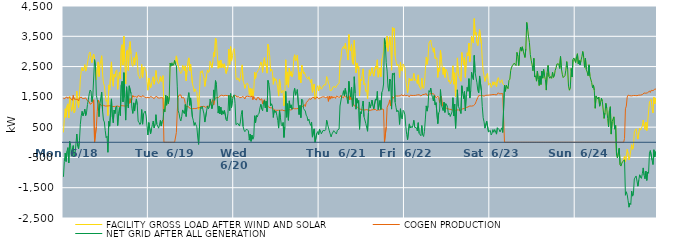
| Category | FACILITY GROSS LOAD AFTER WIND AND SOLAR | COGEN PRODUCTION | NET GRID AFTER ALL GENERATION |
|---|---|---|---|
|  Mon  6/18 | 328 | 1469 | -1141 |
|  Mon  6/18 | 793 | 1427 | -634 |
|  Mon  6/18 | 1109 | 1465 | -356 |
|  Mon  6/18 | 823 | 1457 | -634 |
|  Mon  6/18 | 1199 | 1496 | -297 |
|  Mon  6/18 | 1269 | 1446 | -177 |
|  Mon  6/18 | 801 | 1483 | -682 |
|  Mon  6/18 | 1516 | 1486 | 30 |
|  Mon  6/18 | 1353 | 1456 | -103 |
|  Mon  6/18 | 1024 | 1482 | -458 |
|  Mon  6/18 | 1159 | 1386 | -227 |
|  Mon  6/18 | 1441 | 1549 | -108 |
|  Mon  6/18 | 972 | 1428 | -456 |
|  Mon  6/18 | 1019 | 1435 | -416 |
|  Mon  6/18 | 1017 | 1418 | -401 |
|  Mon  6/18 | 1689 | 1416 | 273 |
|  Mon  6/18 | 1295 | 1422 | -127 |
|  Mon  6/18 | 1149 | 1365 | -216 |
|  Mon  6/18 | 1517 | 1464 | 53 |
|  Mon  6/18 | 2078 | 1487 | 591 |
|  Mon  6/18 | 2368 | 1494 | 874 |
|  Mon  6/18 | 2473 | 1451 | 1022 |
|  Mon  6/18 | 2356 | 1480 | 876 |
|  Mon  6/18 | 2409 | 1445 | 964 |
|  Mon  6/18 | 2563 | 1469 | 1094 |
|  Mon  6/18 | 2349 | 1466 | 883 |
|  Mon  6/18 | 2441 | 1449 | 992 |
|  Mon  6/18 | 2617 | 1369 | 1248 |
|  Mon  6/18 | 2774 | 1373 | 1401 |
|  Mon  6/18 | 2936 | 1337 | 1599 |
|  Mon  6/18 | 2981 | 1257 | 1724 |
|  Mon  6/18 | 2976 | 1289 | 1687 |
|  Mon  6/18 | 2630 | 1289 | 1341 |
|  Mon  6/18 | 2830 | 1310 | 1520 |
|  Mon  6/18 | 2912 | 1403 | 1509 |
|  Mon  6/18 | 2727 | 0 | 2727 |
|  Mon  6/18 | 2515 | 0 | 2515 |
|  Mon  6/18 | 2067 | 514 | 1553 |
|  Mon  6/18 | 2418 | 1008 | 1410 |
|  Mon  6/18 | 2655 | 1392 | 1263 |
|  Mon  6/18 | 2171 | 1325 | 846 |
|  Mon  6/18 | 2541 | 1271 | 1270 |
|  Mon  6/18 | 2552 | 1256 | 1296 |
|  Mon  6/18 | 2857 | 1201 | 1656 |
|  Mon  6/18 | 2251 | 1218 | 1033 |
|  Mon  6/18 | 1954 | 1220 | 734 |
|  Mon  6/18 | 1869 | 1198 | 671 |
|  Mon  6/18 | 1580 | 1197 | 383 |
|  Mon  6/18 | 1352 | 1202 | 150 |
|  Mon  6/18 | 1397 | 1198 | 199 |
|  Mon  6/18 | 882 | 1212 | -330 |
|  Mon  6/18 | 1893 | 1204 | 689 |
|  Mon  6/18 | 1726 | 1194 | 532 |
|  Mon  6/18 | 1745 | 1208 | 537 |
|  Mon  6/18 | 2654 | 1222 | 1432 |
|  Mon  6/18 | 2019 | 1182 | 837 |
|  Mon  6/18 | 1850 | 1205 | 645 |
|  Mon  6/18 | 2243 | 1181 | 1062 |
|  Mon  6/18 | 2153 | 1204 | 949 |
|  Mon  6/18 | 2346 | 1188 | 1158 |
|  Mon  6/18 | 2393 | 1194 | 1199 |
|  Mon  6/18 | 1749 | 1196 | 553 |
|  Mon  6/18 | 2122 | 1174 | 948 |
|  Mon  6/18 | 2320 | 1174 | 1146 |
|  Mon  6/18 | 2092 | 1210 | 882 |
|  Mon  6/18 | 3086 | 1198 | 1888 |
|  Mon  6/18 | 3224 | 1208 | 2016 |
|  Mon  6/18 | 2547 | 1211 | 1336 |
|  Mon  6/18 | 3500 | 1201 | 2299 |
|  Mon  6/18 | 2653 | 1183 | 1470 |
|  Mon  6/18 | 1926 | 1194 | 732 |
|  Mon  6/18 | 3005 | 1172 | 1833 |
|  Mon  6/18 | 3051 | 1212 | 1839 |
|  Mon  6/18 | 2370 | 1235 | 1135 |
|  Mon  6/18 | 3142 | 1277 | 1865 |
|  Mon  6/18 | 3326 | 1443 | 1883 |
|  Mon  6/18 | 2908 | 1300 | 1608 |
|  Mon  6/18 | 2556 | 1435 | 1121 |
|  Mon  6/18 | 2505 | 1551 | 954 |
|  Mon  6/18 | 2797 | 1496 | 1301 |
|  Mon  6/18 | 2553 | 1522 | 1031 |
|  Mon  6/18 | 2809 | 1509 | 1300 |
|  Mon  6/18 | 2974 | 1542 | 1432 |
|  Mon  6/18 | 2720 | 1483 | 1237 |
|  Mon  6/18 | 2244 | 1544 | 700 |
|  Mon  6/18 | 2173 | 1518 | 655 |
|  Mon  6/18 | 2100 | 1514 | 586 |
|  Mon  6/18 | 2166 | 1529 | 637 |
|  Mon  6/18 | 2574 | 1493 | 1081 |
|  Mon  6/18 | 2142 | 1544 | 598 |
|  Mon  6/18 | 2454 | 1520 | 934 |
|  Mon  6/18 | 2493 | 1501 | 992 |
|  Mon  6/18 | 2506 | 1474 | 1032 |
|  Mon  6/18 | 2337 | 1472 | 865 |
|  Mon  6/18 | 2011 | 1471 | 540 |
|  Mon  6/18 | 1720 | 1479 | 241 |
|  Tue  6/19 | 2120 | 1469 | 651 |
|  Tue  6/19 | 2129 | 1468 | 661 |
|  Tue  6/19 | 1794 | 1511 | 283 |
|  Tue  6/19 | 1928 | 1484 | 444 |
|  Tue  6/19 | 2064 | 1482 | 582 |
|  Tue  6/19 | 2163 | 1461 | 702 |
|  Tue  6/19 | 1915 | 1439 | 476 |
|  Tue  6/19 | 2080 | 1490 | 590 |
|  Tue  6/19 | 2370 | 1459 | 911 |
|  Tue  6/19 | 2109 | 1515 | 594 |
|  Tue  6/19 | 2003 | 1466 | 537 |
|  Tue  6/19 | 1936 | 1471 | 465 |
|  Tue  6/19 | 2025 | 1459 | 566 |
|  Tue  6/19 | 2174 | 1452 | 722 |
|  Tue  6/19 | 2010 | 1474 | 536 |
|  Tue  6/19 | 2144 | 1449 | 695 |
|  Tue  6/19 | 2201 | 1463 | 738 |
|  Tue  6/19 | 1087 | 0 | 1087 |
|  Tue  6/19 | 1010 | 0 | 1010 |
|  Tue  6/19 | 1556 | 0 | 1556 |
|  Tue  6/19 | 1223 | 0 | 1223 |
|  Tue  6/19 | 1526 | 0 | 1526 |
|  Tue  6/19 | 1279 | 0 | 1279 |
|  Tue  6/19 | 1488 | 0 | 1488 |
|  Tue  6/19 | 2611 | 0 | 2611 |
|  Tue  6/19 | 2515 | 0 | 2515 |
|  Tue  6/19 | 2625 | 0 | 2625 |
|  Tue  6/19 | 2528 | 0 | 2528 |
|  Tue  6/19 | 2587 | 0 | 2587 |
|  Tue  6/19 | 2700 | 0 | 2700 |
|  Tue  6/19 | 2563 | 0 | 2563 |
|  Tue  6/19 | 2852 | 323 | 2529 |
|  Tue  6/19 | 2860 | 1007 | 1853 |
|  Tue  6/19 | 2523 | 1485 | 1038 |
|  Tue  6/19 | 2517 | 1558 | 959 |
|  Tue  6/19 | 2337 | 1550 | 787 |
|  Tue  6/19 | 2269 | 1564 | 705 |
|  Tue  6/19 | 2304 | 1461 | 843 |
|  Tue  6/19 | 2541 | 1473 | 1068 |
|  Tue  6/19 | 2466 | 1482 | 984 |
|  Tue  6/19 | 2366 | 1423 | 943 |
|  Tue  6/19 | 2523 | 1275 | 1248 |
|  Tue  6/19 | 2031 | 1179 | 852 |
|  Tue  6/19 | 2388 | 1190 | 1198 |
|  Tue  6/19 | 2675 | 1194 | 1481 |
|  Tue  6/19 | 2787 | 1148 | 1639 |
|  Tue  6/19 | 2360 | 1140 | 1220 |
|  Tue  6/19 | 2581 | 1116 | 1465 |
|  Tue  6/19 | 2606 | 1125 | 1481 |
|  Tue  6/19 | 1946 | 1108 | 838 |
|  Tue  6/19 | 1826 | 1099 | 727 |
|  Tue  6/19 | 1674 | 1115 | 559 |
|  Tue  6/19 | 1763 | 1113 | 650 |
|  Tue  6/19 | 1686 | 1114 | 572 |
|  Tue  6/19 | 1640 | 1128 | 512 |
|  Tue  6/19 | 1310 | 1136 | 174 |
|  Tue  6/19 | 1082 | 1151 | -69 |
|  Tue  6/19 | 1673 | 1140 | 533 |
|  Tue  6/19 | 2337 | 1182 | 1155 |
|  Tue  6/19 | 2299 | 1186 | 1113 |
|  Tue  6/19 | 2368 | 1180 | 1188 |
|  Tue  6/19 | 2357 | 1174 | 1183 |
|  Tue  6/19 | 2124 | 1188 | 936 |
|  Tue  6/19 | 1845 | 1177 | 668 |
|  Tue  6/19 | 1827 | 1153 | 674 |
|  Tue  6/19 | 2212 | 1175 | 1037 |
|  Tue  6/19 | 2391 | 1192 | 1199 |
|  Tue  6/19 | 2308 | 1200 | 1108 |
|  Tue  6/19 | 2342 | 1193 | 1149 |
|  Tue  6/19 | 2671 | 1246 | 1425 |
|  Tue  6/19 | 2683 | 1264 | 1419 |
|  Tue  6/19 | 2459 | 1349 | 1110 |
|  Tue  6/19 | 2659 | 1412 | 1247 |
|  Tue  6/19 | 2966 | 1236 | 1730 |
|  Tue  6/19 | 2828 | 1439 | 1389 |
|  Tue  6/19 | 3443 | 1407 | 2036 |
|  Tue  6/19 | 3390 | 1473 | 1917 |
|  Tue  6/19 | 2914 | 1487 | 1427 |
|  Tue  6/19 | 2440 | 1476 | 964 |
|  Tue  6/19 | 2690 | 1494 | 1196 |
|  Tue  6/19 | 2467 | 1531 | 936 |
|  Tue  6/19 | 2712 | 1552 | 1160 |
|  Tue  6/19 | 2469 | 1557 | 912 |
|  Tue  6/19 | 2590 | 1552 | 1038 |
|  Tue  6/19 | 2466 | 1534 | 932 |
|  Tue  6/19 | 2591 | 1541 | 1050 |
|  Tue  6/19 | 2617 | 1549 | 1068 |
|  Tue  6/19 | 2273 | 1523 | 750 |
|  Tue  6/19 | 2247 | 1542 | 705 |
|  Tue  6/19 | 2501 | 1542 | 959 |
|  Tue  6/19 | 3079 | 1529 | 1550 |
|  Tue  6/19 | 2564 | 1517 | 1047 |
|  Tue  6/19 | 3158 | 1551 | 1607 |
|  Tue  6/19 | 2681 | 1538 | 1143 |
|  Tue  6/19 | 2857 | 1474 | 1383 |
|  Tue  6/19 | 3035 | 1507 | 1528 |
|  Wed  6/20 | 3095 | 1528 | 1567 |
|  Wed  6/20 | 2805 | 1521 | 1284 |
|  Wed  6/20 | 2128 | 1546 | 582 |
|  Wed  6/20 | 2063 | 1497 | 566 |
|  Wed  6/20 | 2129 | 1500 | 629 |
|  Wed  6/20 | 2105 | 1508 | 597 |
|  Wed  6/20 | 2009 | 1473 | 536 |
|  Wed  6/20 | 2148 | 1475 | 673 |
|  Wed  6/20 | 2399 | 1478 | 921 |
|  Wed  6/20 | 2557 | 1508 | 1049 |
|  Wed  6/20 | 2042 | 1515 | 527 |
|  Wed  6/20 | 1943 | 1535 | 408 |
|  Wed  6/20 | 1781 | 1430 | 351 |
|  Wed  6/20 | 1903 | 1510 | 393 |
|  Wed  6/20 | 1922 | 1486 | 436 |
|  Wed  6/20 | 1949 | 1522 | 427 |
|  Wed  6/20 | 1867 | 1490 | 377 |
|  Wed  6/20 | 1578 | 1508 | 70 |
|  Wed  6/20 | 1791 | 1517 | 274 |
|  Wed  6/20 | 1527 | 1496 | 31 |
|  Wed  6/20 | 1767 | 1532 | 235 |
|  Wed  6/20 | 1510 | 1409 | 101 |
|  Wed  6/20 | 1682 | 1509 | 173 |
|  Wed  6/20 | 2321 | 1445 | 876 |
|  Wed  6/20 | 2107 | 1468 | 639 |
|  Wed  6/20 | 2281 | 1396 | 885 |
|  Wed  6/20 | 2308 | 1475 | 833 |
|  Wed  6/20 | 2369 | 1449 | 920 |
|  Wed  6/20 | 2428 | 1468 | 960 |
|  Wed  6/20 | 2531 | 1392 | 1139 |
|  Wed  6/20 | 2653 | 1400 | 1253 |
|  Wed  6/20 | 2540 | 1437 | 1103 |
|  Wed  6/20 | 2309 | 1269 | 1040 |
|  Wed  6/20 | 2669 | 1363 | 1306 |
|  Wed  6/20 | 2794 | 1410 | 1384 |
|  Wed  6/20 | 2527 | 1390 | 1137 |
|  Wed  6/20 | 2579 | 1222 | 1357 |
|  Wed  6/20 | 2282 | 1272 | 1010 |
|  Wed  6/20 | 3236 | 1193 | 2043 |
|  Wed  6/20 | 3092 | 1154 | 1938 |
|  Wed  6/20 | 2837 | 1141 | 1696 |
|  Wed  6/20 | 2342 | 1139 | 1203 |
|  Wed  6/20 | 2414 | 1144 | 1270 |
|  Wed  6/20 | 2335 | 1134 | 1201 |
|  Wed  6/20 | 1913 | 1093 | 820 |
|  Wed  6/20 | 2129 | 1070 | 1059 |
|  Wed  6/20 | 2044 | 1059 | 985 |
|  Wed  6/20 | 2098 | 1066 | 1032 |
|  Wed  6/20 | 1945 | 1056 | 889 |
|  Wed  6/20 | 1797 | 1071 | 726 |
|  Wed  6/20 | 1525 | 1057 | 468 |
|  Wed  6/20 | 2090 | 1043 | 1047 |
|  Wed  6/20 | 1868 | 1056 | 812 |
|  Wed  6/20 | 1625 | 1039 | 586 |
|  Wed  6/20 | 1606 | 1068 | 538 |
|  Wed  6/20 | 1715 | 1061 | 654 |
|  Wed  6/20 | 1202 | 1042 | 160 |
|  Wed  6/20 | 1587 | 1066 | 521 |
|  Wed  6/20 | 2725 | 1046 | 1679 |
|  Wed  6/20 | 1900 | 1074 | 826 |
|  Wed  6/20 | 2323 | 1049 | 1274 |
|  Wed  6/20 | 1816 | 1090 | 726 |
|  Wed  6/20 | 2452 | 1084 | 1368 |
|  Wed  6/20 | 2200 | 1067 | 1133 |
|  Wed  6/20 | 2334 | 1098 | 1236 |
|  Wed  6/20 | 2167 | 1077 | 1090 |
|  Wed  6/20 | 2254 | 1130 | 1124 |
|  Wed  6/20 | 2778 | 1117 | 1661 |
|  Wed  6/20 | 2889 | 1107 | 1782 |
|  Wed  6/20 | 2681 | 1127 | 1554 |
|  Wed  6/20 | 2719 | 1109 | 1610 |
|  Wed  6/20 | 2880 | 1140 | 1740 |
|  Wed  6/20 | 2852 | 1115 | 1737 |
|  Wed  6/20 | 2069 | 1153 | 916 |
|  Wed  6/20 | 2319 | 1100 | 1219 |
|  Wed  6/20 | 1967 | 1155 | 812 |
|  Wed  6/20 | 2551 | 1129 | 1422 |
|  Wed  6/20 | 2568 | 1183 | 1385 |
|  Wed  6/20 | 2268 | 1152 | 1116 |
|  Wed  6/20 | 2311 | 1242 | 1069 |
|  Wed  6/20 | 2213 | 1181 | 1032 |
|  Wed  6/20 | 2202 | 1306 | 896 |
|  Wed  6/20 | 2118 | 1274 | 844 |
|  Wed  6/20 | 2081 | 1373 | 708 |
|  Wed  6/20 | 2166 | 1402 | 764 |
|  Wed  6/20 | 2070 | 1445 | 625 |
|  Wed  6/20 | 1969 | 1411 | 558 |
|  Wed  6/20 | 2085 | 1415 | 670 |
|  Wed  6/20 | 1650 | 1480 | 170 |
|  Wed  6/20 | 1664 | 1476 | 188 |
|  Wed  6/20 | 1925 | 1482 | 443 |
|  Wed  6/20 | 1421 | 1422 | -1 |
|  Wed  6/20 | 1470 | 1458 | 12 |
|  Wed  6/20 | 1805 | 1504 | 301 |
|  Wed  6/20 | 1869 | 1515 | 354 |
|  Wed  6/20 | 1695 | 1440 | 255 |
|  Thu  6/21 | 1870 | 1438 | 432 |
|  Thu  6/21 | 1845 | 1468 | 377 |
|  Thu  6/21 | 1751 | 1473 | 278 |
|  Thu  6/21 | 1771 | 1497 | 274 |
|  Thu  6/21 | 1858 | 1466 | 392 |
|  Thu  6/21 | 1899 | 1500 | 399 |
|  Thu  6/21 | 1893 | 1510 | 383 |
|  Thu  6/21 | 1893 | 1470 | 423 |
|  Thu  6/21 | 2171 | 1443 | 728 |
|  Thu  6/21 | 2107 | 1509 | 598 |
|  Thu  6/21 | 1949 | 1352 | 597 |
|  Thu  6/21 | 1903 | 1526 | 377 |
|  Thu  6/21 | 1701 | 1426 | 275 |
|  Thu  6/21 | 1703 | 1526 | 177 |
|  Thu  6/21 | 1726 | 1451 | 275 |
|  Thu  6/21 | 1820 | 1514 | 306 |
|  Thu  6/21 | 1848 | 1466 | 382 |
|  Thu  6/21 | 1850 | 1505 | 345 |
|  Thu  6/21 | 1795 | 1449 | 346 |
|  Thu  6/21 | 1800 | 1527 | 273 |
|  Thu  6/21 | 1903 | 1508 | 395 |
|  Thu  6/21 | 1871 | 1495 | 376 |
|  Thu  6/21 | 1947 | 1508 | 439 |
|  Thu  6/21 | 2687 | 1489 | 1198 |
|  Thu  6/21 | 2749 | 1551 | 1198 |
|  Thu  6/21 | 3042 | 1507 | 1535 |
|  Thu  6/21 | 3113 | 1539 | 1574 |
|  Thu  6/21 | 3166 | 1464 | 1702 |
|  Thu  6/21 | 3091 | 1555 | 1536 |
|  Thu  6/21 | 3273 | 1494 | 1779 |
|  Thu  6/21 | 3072 | 1479 | 1593 |
|  Thu  6/21 | 2939 | 1508 | 1431 |
|  Thu  6/21 | 2715 | 1436 | 1279 |
|  Thu  6/21 | 3555 | 1543 | 2012 |
|  Thu  6/21 | 3066 | 1402 | 1664 |
|  Thu  6/21 | 3017 | 1513 | 1504 |
|  Thu  6/21 | 3228 | 1407 | 1821 |
|  Thu  6/21 | 2635 | 1450 | 1185 |
|  Thu  6/21 | 2573 | 1282 | 1291 |
|  Thu  6/21 | 3365 | 1201 | 2164 |
|  Thu  6/21 | 2830 | 1215 | 1615 |
|  Thu  6/21 | 2290 | 1198 | 1092 |
|  Thu  6/21 | 2620 | 1174 | 1446 |
|  Thu  6/21 | 2442 | 1149 | 1293 |
|  Thu  6/21 | 2503 | 1125 | 1378 |
|  Thu  6/21 | 1532 | 1102 | 430 |
|  Thu  6/21 | 2087 | 1081 | 1006 |
|  Thu  6/21 | 2027 | 1083 | 944 |
|  Thu  6/21 | 2247 | 1070 | 1177 |
|  Thu  6/21 | 2425 | 1063 | 1362 |
|  Thu  6/21 | 1898 | 1054 | 844 |
|  Thu  6/21 | 1944 | 1067 | 877 |
|  Thu  6/21 | 1677 | 1053 | 624 |
|  Thu  6/21 | 1718 | 1079 | 639 |
|  Thu  6/21 | 1429 | 1065 | 364 |
|  Thu  6/21 | 2036 | 1058 | 978 |
|  Thu  6/21 | 2392 | 1060 | 1332 |
|  Thu  6/21 | 2193 | 1052 | 1141 |
|  Thu  6/21 | 2317 | 1075 | 1242 |
|  Thu  6/21 | 2466 | 1072 | 1394 |
|  Thu  6/21 | 2291 | 1080 | 1211 |
|  Thu  6/21 | 2183 | 1078 | 1105 |
|  Thu  6/21 | 2186 | 1063 | 1123 |
|  Thu  6/21 | 2517 | 1086 | 1431 |
|  Thu  6/21 | 2439 | 1050 | 1389 |
|  Thu  6/21 | 2723 | 1042 | 1681 |
|  Thu  6/21 | 2150 | 1069 | 1081 |
|  Thu  6/21 | 2121 | 1068 | 1053 |
|  Thu  6/21 | 2448 | 1067 | 1381 |
|  Thu  6/21 | 2166 | 1081 | 1085 |
|  Thu  6/21 | 2746 | 1102 | 1644 |
|  Thu  6/21 | 2811 | 1093 | 1718 |
|  Thu  6/21 | 3007 | 1083 | 1924 |
|  Thu  6/21 | 3428 | 0 | 3428 |
|  Thu  6/21 | 3237 | 0 | 3237 |
|  Thu  6/21 | 3136 | 507 | 2629 |
|  Thu  6/21 | 3507 | 1156 | 2351 |
|  Thu  6/21 | 3004 | 1180 | 1824 |
|  Thu  6/21 | 2978 | 1292 | 1686 |
|  Thu  6/21 | 3486 | 1400 | 2086 |
|  Thu  6/21 | 3215 | 1199 | 2016 |
|  Thu  6/21 | 2380 | 1285 | 1095 |
|  Thu  6/21 | 3786 | 1512 | 2274 |
|  Thu  6/21 | 3689 | 1454 | 2235 |
|  Thu  6/21 | 3775 | 1484 | 2291 |
|  Thu  6/21 | 2858 | 1534 | 1324 |
|  Thu  6/21 | 2680 | 1528 | 1152 |
|  Thu  6/21 | 2528 | 1526 | 1002 |
|  Thu  6/21 | 2577 | 1519 | 1058 |
|  Thu  6/21 | 2524 | 1529 | 995 |
|  Thu  6/21 | 2139 | 1549 | 590 |
|  Thu  6/21 | 2642 | 1536 | 1106 |
|  Thu  6/21 | 2386 | 1573 | 813 |
|  Thu  6/21 | 2350 | 1580 | 770 |
|  Thu  6/21 | 2587 | 1532 | 1055 |
|  Thu  6/21 | 2582 | 1567 | 1015 |
|  Fri  6/22 | 2458 | 1552 | 906 |
|  Fri  6/22 | 2069 | 1538 | 531 |
|  Fri  6/22 | 1821 | 1559 | 262 |
|  Fri  6/22 | 1634 | 1548 | 86 |
|  Fri  6/22 | 1638 | 1546 | 92 |
|  Fri  6/22 | 2111 | 1504 | 607 |
|  Fri  6/22 | 2028 | 1556 | 472 |
|  Fri  6/22 | 2101 | 1577 | 524 |
|  Fri  6/22 | 2023 | 1546 | 477 |
|  Fri  6/22 | 2103 | 1540 | 563 |
|  Fri  6/22 | 2273 | 1547 | 726 |
|  Fri  6/22 | 2039 | 1544 | 495 |
|  Fri  6/22 | 2075 | 1549 | 526 |
|  Fri  6/22 | 2038 | 1563 | 475 |
|  Fri  6/22 | 1937 | 1565 | 372 |
|  Fri  6/22 | 2225 | 1578 | 647 |
|  Fri  6/22 | 1866 | 1569 | 297 |
|  Fri  6/22 | 1887 | 1576 | 311 |
|  Fri  6/22 | 1745 | 1530 | 215 |
|  Fri  6/22 | 2116 | 1562 | 554 |
|  Fri  6/22 | 1818 | 1574 | 244 |
|  Fri  6/22 | 1777 | 1586 | 191 |
|  Fri  6/22 | 1943 | 1581 | 362 |
|  Fri  6/22 | 2372 | 1606 | 766 |
|  Fri  6/22 | 2809 | 1607 | 1202 |
|  Fri  6/22 | 2573 | 1545 | 1028 |
|  Fri  6/22 | 2771 | 1561 | 1210 |
|  Fri  6/22 | 3275 | 1568 | 1707 |
|  Fri  6/22 | 3258 | 1605 | 1653 |
|  Fri  6/22 | 3377 | 1585 | 1792 |
|  Fri  6/22 | 3186 | 1601 | 1585 |
|  Fri  6/22 | 3101 | 1615 | 1486 |
|  Fri  6/22 | 2972 | 1606 | 1366 |
|  Fri  6/22 | 3118 | 1575 | 1543 |
|  Fri  6/22 | 2766 | 1529 | 1237 |
|  Fri  6/22 | 2774 | 1466 | 1308 |
|  Fri  6/22 | 2787 | 1487 | 1300 |
|  Fri  6/22 | 2142 | 1525 | 617 |
|  Fri  6/22 | 2451 | 1484 | 967 |
|  Fri  6/22 | 2343 | 1312 | 1031 |
|  Fri  6/22 | 3033 | 1294 | 1739 |
|  Fri  6/22 | 2747 | 1510 | 1237 |
|  Fri  6/22 | 2462 | 1209 | 1253 |
|  Fri  6/22 | 2238 | 1190 | 1048 |
|  Fri  6/22 | 2475 | 1153 | 1322 |
|  Fri  6/22 | 2143 | 1156 | 987 |
|  Fri  6/22 | 2416 | 1139 | 1277 |
|  Fri  6/22 | 2360 | 1122 | 1238 |
|  Fri  6/22 | 2258 | 1108 | 1150 |
|  Fri  6/22 | 2005 | 1095 | 910 |
|  Fri  6/22 | 2051 | 1090 | 961 |
|  Fri  6/22 | 1929 | 1078 | 851 |
|  Fri  6/22 | 1962 | 1084 | 878 |
|  Fri  6/22 | 2075 | 1071 | 1004 |
|  Fri  6/22 | 2528 | 1055 | 1473 |
|  Fri  6/22 | 1918 | 1051 | 867 |
|  Fri  6/22 | 2296 | 1035 | 1261 |
|  Fri  6/22 | 1512 | 1052 | 460 |
|  Fri  6/22 | 2084 | 1051 | 1033 |
|  Fri  6/22 | 2787 | 1055 | 1732 |
|  Fri  6/22 | 2269 | 1079 | 1190 |
|  Fri  6/22 | 2175 | 1045 | 1130 |
|  Fri  6/22 | 2156 | 1059 | 1097 |
|  Fri  6/22 | 2015 | 1065 | 950 |
|  Fri  6/22 | 2963 | 1097 | 1866 |
|  Fri  6/22 | 2726 | 1105 | 1621 |
|  Fri  6/22 | 2561 | 1118 | 1443 |
|  Fri  6/22 | 2796 | 1118 | 1678 |
|  Fri  6/22 | 2144 | 1105 | 1039 |
|  Fri  6/22 | 2707 | 1147 | 1560 |
|  Fri  6/22 | 2955 | 1142 | 1813 |
|  Fri  6/22 | 2853 | 1168 | 1685 |
|  Fri  6/22 | 3274 | 1173 | 2101 |
|  Fri  6/22 | 2659 | 1199 | 1460 |
|  Fri  6/22 | 2911 | 1202 | 1709 |
|  Fri  6/22 | 3504 | 1194 | 2310 |
|  Fri  6/22 | 3346 | 1205 | 2141 |
|  Fri  6/22 | 3277 | 1207 | 2070 |
|  Fri  6/22 | 4084 | 1215 | 2869 |
|  Fri  6/22 | 3560 | 1261 | 2299 |
|  Fri  6/22 | 3625 | 1339 | 2286 |
|  Fri  6/22 | 3286 | 1321 | 1965 |
|  Fri  6/22 | 3193 | 1482 | 1711 |
|  Fri  6/22 | 3173 | 1540 | 1633 |
|  Fri  6/22 | 3721 | 1531 | 2190 |
|  Fri  6/22 | 3726 | 1542 | 2184 |
|  Fri  6/22 | 3251 | 1546 | 1705 |
|  Fri  6/22 | 2720 | 1542 | 1178 |
|  Fri  6/22 | 2353 | 1540 | 813 |
|  Fri  6/22 | 2200 | 1523 | 677 |
|  Fri  6/22 | 2010 | 1543 | 467 |
|  Fri  6/22 | 1995 | 1552 | 443 |
|  Fri  6/22 | 2236 | 1542 | 694 |
|  Fri  6/22 | 2280 | 1553 | 727 |
|  Fri  6/22 | 1884 | 1541 | 343 |
|  Fri  6/22 | 1900 | 1560 | 340 |
|  Sat  6/23 | 1957 | 1566 | 391 |
|  Sat  6/23 | 1811 | 1568 | 243 |
|  Sat  6/23 | 1875 | 1577 | 298 |
|  Sat  6/23 | 1997 | 1577 | 420 |
|  Sat  6/23 | 1888 | 1559 | 329 |
|  Sat  6/23 | 1997 | 1576 | 421 |
|  Sat  6/23 | 1974 | 1582 | 392 |
|  Sat  6/23 | 1830 | 1561 | 269 |
|  Sat  6/23 | 2061 | 1582 | 479 |
|  Sat  6/23 | 2135 | 1636 | 499 |
|  Sat  6/23 | 2018 | 1601 | 417 |
|  Sat  6/23 | 1967 | 1625 | 342 |
|  Sat  6/23 | 1947 | 1603 | 344 |
|  Sat  6/23 | 2065 | 1587 | 478 |
|  Sat  6/23 | 1934 | 1609 | 325 |
|  Sat  6/23 | 1907 | 1601 | 306 |
|  Sat  6/23 | 1883 | 0 | 1883 |
|  Sat  6/23 | 1684 | 0 | 1684 |
|  Sat  6/23 | 1884 | 0 | 1884 |
|  Sat  6/23 | 1860 | 0 | 1860 |
|  Sat  6/23 | 1769 | 0 | 1769 |
|  Sat  6/23 | 2043 | 0 | 2043 |
|  Sat  6/23 | 2083 | 0 | 2083 |
|  Sat  6/23 | 2373 | 0 | 2373 |
|  Sat  6/23 | 2481 | 0 | 2481 |
|  Sat  6/23 | 2536 | 0 | 2536 |
|  Sat  6/23 | 2535 | 0 | 2535 |
|  Sat  6/23 | 2614 | 0 | 2614 |
|  Sat  6/23 | 2627 | 0 | 2627 |
|  Sat  6/23 | 2533 | 0 | 2533 |
|  Sat  6/23 | 2967 | 0 | 2967 |
|  Sat  6/23 | 2842 | 0 | 2842 |
|  Sat  6/23 | 2535 | 0 | 2535 |
|  Sat  6/23 | 2967 | 0 | 2967 |
|  Sat  6/23 | 3139 | 0 | 3139 |
|  Sat  6/23 | 3011 | 0 | 3011 |
|  Sat  6/23 | 3152 | 0 | 3152 |
|  Sat  6/23 | 3018 | 0 | 3018 |
|  Sat  6/23 | 3023 | 0 | 3023 |
|  Sat  6/23 | 2801 | 0 | 2801 |
|  Sat  6/23 | 3089 | 0 | 3089 |
|  Sat  6/23 | 3957 | 0 | 3957 |
|  Sat  6/23 | 3746 | 0 | 3746 |
|  Sat  6/23 | 3490 | 0 | 3490 |
|  Sat  6/23 | 3301 | 0 | 3301 |
|  Sat  6/23 | 2903 | 0 | 2903 |
|  Sat  6/23 | 2712 | 0 | 2712 |
|  Sat  6/23 | 2564 | 0 | 2564 |
|  Sat  6/23 | 2365 | 0 | 2365 |
|  Sat  6/23 | 2772 | 0 | 2772 |
|  Sat  6/23 | 2155 | 0 | 2155 |
|  Sat  6/23 | 2194 | 0 | 2194 |
|  Sat  6/23 | 2018 | 0 | 2018 |
|  Sat  6/23 | 2353 | 0 | 2353 |
|  Sat  6/23 | 2076 | 0 | 2076 |
|  Sat  6/23 | 1874 | 0 | 1874 |
|  Sat  6/23 | 2192 | 0 | 2192 |
|  Sat  6/23 | 1908 | 0 | 1908 |
|  Sat  6/23 | 2351 | 0 | 2351 |
|  Sat  6/23 | 2117 | 0 | 2117 |
|  Sat  6/23 | 2407 | 0 | 2407 |
|  Sat  6/23 | 2196 | 0 | 2196 |
|  Sat  6/23 | 2068 | 0 | 2068 |
|  Sat  6/23 | 1724 | 0 | 1724 |
|  Sat  6/23 | 2302 | 0 | 2302 |
|  Sat  6/23 | 2539 | 0 | 2539 |
|  Sat  6/23 | 2172 | 0 | 2172 |
|  Sat  6/23 | 2114 | 0 | 2114 |
|  Sat  6/23 | 2173 | 0 | 2173 |
|  Sat  6/23 | 2111 | 0 | 2111 |
|  Sat  6/23 | 2319 | 0 | 2319 |
|  Sat  6/23 | 2142 | 0 | 2142 |
|  Sat  6/23 | 2188 | 0 | 2188 |
|  Sat  6/23 | 2371 | 0 | 2371 |
|  Sat  6/23 | 2461 | 0 | 2461 |
|  Sat  6/23 | 2587 | 0 | 2587 |
|  Sat  6/23 | 2609 | 0 | 2609 |
|  Sat  6/23 | 2584 | 0 | 2584 |
|  Sat  6/23 | 2439 | 0 | 2439 |
|  Sat  6/23 | 2834 | 0 | 2834 |
|  Sat  6/23 | 2422 | 0 | 2422 |
|  Sat  6/23 | 2246 | 0 | 2246 |
|  Sat  6/23 | 2137 | 0 | 2137 |
|  Sat  6/23 | 2104 | 0 | 2104 |
|  Sat  6/23 | 2200 | 0 | 2200 |
|  Sat  6/23 | 2381 | 0 | 2381 |
|  Sat  6/23 | 2663 | 0 | 2663 |
|  Sat  6/23 | 2413 | 0 | 2413 |
|  Sat  6/23 | 1855 | 0 | 1855 |
|  Sat  6/23 | 1719 | 0 | 1719 |
|  Sat  6/23 | 1792 | 0 | 1792 |
|  Sat  6/23 | 2441 | 0 | 2441 |
|  Sat  6/23 | 2155 | 0 | 2155 |
|  Sat  6/23 | 2727 | 0 | 2727 |
|  Sat  6/23 | 2784 | 0 | 2784 |
|  Sat  6/23 | 2816 | 0 | 2816 |
|  Sun  6/24 | 2632 | 0 | 2632 |
|  Sun  6/24 | 2828 | 0 | 2828 |
|  Sun  6/24 | 2924 | 0 | 2924 |
|  Sun  6/24 | 2589 | 0 | 2589 |
|  Sun  6/24 | 2699 | 0 | 2699 |
|  Sun  6/24 | 2551 | 0 | 2551 |
|  Sun  6/24 | 2703 | 0 | 2703 |
|  Sun  6/24 | 2822 | 0 | 2822 |
|  Sun  6/24 | 2997 | 0 | 2997 |
|  Sun  6/24 | 2819 | 0 | 2819 |
|  Sun  6/24 | 2476 | 0 | 2476 |
|  Sun  6/24 | 2781 | 0 | 2781 |
|  Sun  6/24 | 2402 | 0 | 2402 |
|  Sun  6/24 | 2318 | 0 | 2318 |
|  Sun  6/24 | 2198 | 0 | 2198 |
|  Sun  6/24 | 2559 | 0 | 2559 |
|  Sun  6/24 | 2192 | 0 | 2192 |
|  Sun  6/24 | 2182 | 0 | 2182 |
|  Sun  6/24 | 1974 | 0 | 1974 |
|  Sun  6/24 | 1804 | 0 | 1804 |
|  Sun  6/24 | 1893 | 0 | 1893 |
|  Sun  6/24 | 1715 | 0 | 1715 |
|  Sun  6/24 | 1123 | 0 | 1123 |
|  Sun  6/24 | 1531 | 0 | 1531 |
|  Sun  6/24 | 1539 | 0 | 1539 |
|  Sun  6/24 | 1427 | 0 | 1427 |
|  Sun  6/24 | 1495 | 0 | 1495 |
|  Sun  6/24 | 1192 | 0 | 1192 |
|  Sun  6/24 | 1312 | 0 | 1312 |
|  Sun  6/24 | 1458 | 0 | 1458 |
|  Sun  6/24 | 1350 | 0 | 1350 |
|  Sun  6/24 | 1380 | 0 | 1380 |
|  Sun  6/24 | 790 | 0 | 790 |
|  Sun  6/24 | 972 | 0 | 972 |
|  Sun  6/24 | 1287 | 0 | 1287 |
|  Sun  6/24 | 1120 | 0 | 1120 |
|  Sun  6/24 | 791 | 0 | 791 |
|  Sun  6/24 | 509 | 0 | 509 |
|  Sun  6/24 | 1054 | 0 | 1054 |
|  Sun  6/24 | 1175 | 0 | 1175 |
|  Sun  6/24 | 271 | 0 | 271 |
|  Sun  6/24 | 685 | 0 | 685 |
|  Sun  6/24 | 709 | 0 | 709 |
|  Sun  6/24 | 840 | 0 | 840 |
|  Sun  6/24 | 434 | 0 | 434 |
|  Sun  6/24 | 554 | 0 | 554 |
|  Sun  6/24 | -422 | 0 | -422 |
|  Sun  6/24 | -516 | 0 | -516 |
|  Sun  6/24 | -545 | 0 | -545 |
|  Sun  6/24 | -198 | 0 | -198 |
|  Sun  6/24 | -740 | 0 | -740 |
|  Sun  6/24 | -786 | 0 | -786 |
|  Sun  6/24 | -687 | 0 | -687 |
|  Sun  6/24 | -633 | 0 | -633 |
|  Sun  6/24 | -640 | 0 | -640 |
|  Sun  6/24 | -458 | 123 | -581 |
|  Sun  6/24 | -643 | 1105 | -1748 |
|  Sun  6/24 | -441 | 1194 | -1635 |
|  Sun  6/24 | -235 | 1496 | -1731 |
|  Sun  6/24 | -370 | 1558 | -1928 |
|  Sun  6/24 | -584 | 1559 | -2143 |
|  Sun  6/24 | -473 | 1537 | -2010 |
|  Sun  6/24 | -488 | 1567 | -2055 |
|  Sun  6/24 | -80 | 1533 | -1613 |
|  Sun  6/24 | -231 | 1546 | -1777 |
|  Sun  6/24 | -144 | 1545 | -1689 |
|  Sun  6/24 | 341 | 1550 | -1209 |
|  Sun  6/24 | 322 | 1544 | -1222 |
|  Sun  6/24 | 445 | 1557 | -1112 |
|  Sun  6/24 | 259 | 1539 | -1280 |
|  Sun  6/24 | 105 | 1555 | -1450 |
|  Sun  6/24 | 302 | 1556 | -1254 |
|  Sun  6/24 | 472 | 1546 | -1074 |
|  Sun  6/24 | 401 | 1558 | -1157 |
|  Sun  6/24 | 384 | 1576 | -1192 |
|  Sun  6/24 | 537 | 1574 | -1037 |
|  Sun  6/24 | 737 | 1583 | -846 |
|  Sun  6/24 | 541 | 1628 | -1087 |
|  Sun  6/24 | 423 | 1629 | -1206 |
|  Sun  6/24 | 666 | 1619 | -953 |
|  Sun  6/24 | 387 | 1646 | -1259 |
|  Sun  6/24 | 657 | 1638 | -981 |
|  Sun  6/24 | 630 | 1656 | -1026 |
|  Sun  6/24 | 1333 | 1691 | -358 |
|  Sun  6/24 | 1373 | 1647 | -274 |
|  Sun  6/24 | 1414 | 1717 | -303 |
|  Sun  6/24 | 1113 | 1704 | -591 |
|  Sun  6/24 | 968 | 1703 | -735 |
|  Sun  6/24 | 1486 | 1734 | -248 |
|  Sun  6/24 | 1265 | 1754 | -489 |
|  Sun  6/24 | 1450 | 1761 | -311 |
|  Sun  6/24 | 1301 | 1758 | -457 |